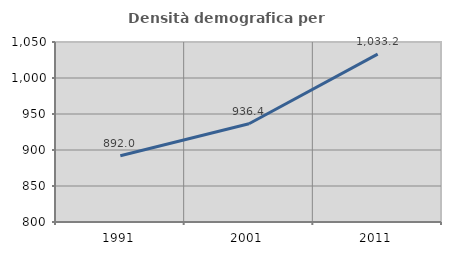
| Category | Densità demografica |
|---|---|
| 1991.0 | 891.988 |
| 2001.0 | 936.388 |
| 2011.0 | 1033.158 |